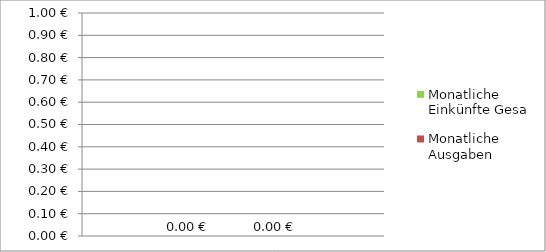
| Category | Monatliche Einkünfte Gesamt | Monatliche Ausgaben Gesamt |
|---|---|---|
|  | 0 | 0 |